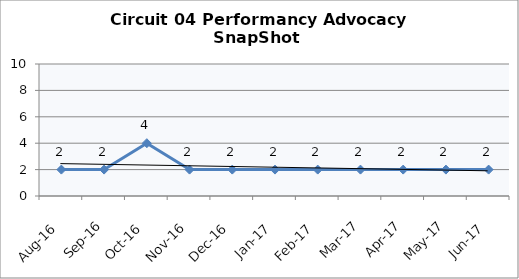
| Category | Circuit 04 |
|---|---|
| Aug-16 | 2 |
| Sep-16 | 2 |
| Oct-16 | 4 |
| Nov-16 | 2 |
| Dec-16 | 2 |
| Jan-17 | 2 |
| Feb-17 | 2 |
| Mar-17 | 2 |
| Apr-17 | 2 |
| May-17 | 2 |
| Jun-17 | 2 |